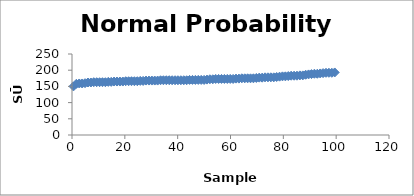
| Category | Series 0 |
|---|---|
| 0.5494505494505495 | 150 |
| 1.6483516483516485 | 158 |
| 2.7472527472527473 | 159 |
| 3.8461538461538467 | 159 |
| 4.945054945054945 | 160 |
| 6.043956043956044 | 162 |
| 7.142857142857143 | 162 |
| 8.241758241758243 | 163 |
| 9.340659340659341 | 163 |
| 10.43956043956044 | 163 |
| 11.538461538461538 | 163 |
| 12.637362637362639 | 163 |
| 13.736263736263737 | 164 |
| 14.835164835164836 | 164 |
| 15.934065934065936 | 165 |
| 17.032967032967036 | 165 |
| 18.131868131868135 | 165 |
| 19.230769230769234 | 165 |
| 20.329670329670332 | 166 |
| 21.42857142857143 | 166 |
| 22.52747252747253 | 166 |
| 23.62637362637363 | 166 |
| 24.72527472527473 | 166 |
| 25.82417582417583 | 167 |
| 26.923076923076927 | 167 |
| 28.021978021978025 | 168 |
| 29.120879120879124 | 168 |
| 30.219780219780223 | 168 |
| 31.318681318681325 | 168 |
| 32.41758241758242 | 168 |
| 33.51648351648352 | 169 |
| 34.61538461538461 | 169 |
| 35.714285714285715 | 169 |
| 36.81318681318682 | 169 |
| 37.91208791208791 | 169 |
| 39.010989010989015 | 169 |
| 40.10989010989011 | 169 |
| 41.20879120879121 | 169 |
| 42.30769230769231 | 169 |
| 43.40659340659341 | 169 |
| 44.505494505494504 | 170 |
| 45.604395604395606 | 170 |
| 46.70329670329671 | 170 |
| 47.8021978021978 | 170 |
| 48.901098901098905 | 170 |
| 50.0 | 170 |
| 51.0989010989011 | 171 |
| 52.1978021978022 | 172 |
| 53.2967032967033 | 172 |
| 54.3956043956044 | 173 |
| 55.494505494505496 | 173 |
| 56.5934065934066 | 173 |
| 57.69230769230769 | 173 |
| 58.791208791208796 | 173 |
| 59.89010989010989 | 173 |
| 60.98901098901099 | 173 |
| 62.087912087912095 | 174 |
| 63.18681318681319 | 174 |
| 64.28571428571429 | 175 |
| 65.3846153846154 | 175 |
| 66.4835164835165 | 175 |
| 67.58241758241759 | 175 |
| 68.68131868131869 | 175 |
| 69.7802197802198 | 176 |
| 70.87912087912089 | 177 |
| 71.97802197802199 | 177 |
| 73.0769230769231 | 178 |
| 74.17582417582419 | 178 |
| 75.27472527472528 | 178 |
| 76.37362637362638 | 178 |
| 77.47252747252749 | 179 |
| 78.57142857142858 | 180 |
| 79.67032967032968 | 181 |
| 80.76923076923079 | 181 |
| 81.86813186813188 | 182 |
| 82.96703296703298 | 183 |
| 84.06593406593407 | 183 |
| 85.16483516483518 | 183 |
| 86.26373626373628 | 184 |
| 87.36263736263737 | 184 |
| 88.46153846153847 | 186 |
| 89.56043956043958 | 187 |
| 90.65934065934067 | 188 |
| 91.75824175824177 | 189 |
| 92.85714285714288 | 189 |
| 93.95604395604397 | 190 |
| 95.05494505494507 | 191 |
| 96.15384615384616 | 192 |
| 97.25274725274727 | 192 |
| 98.35164835164836 | 192 |
| 99.45054945054946 | 193 |